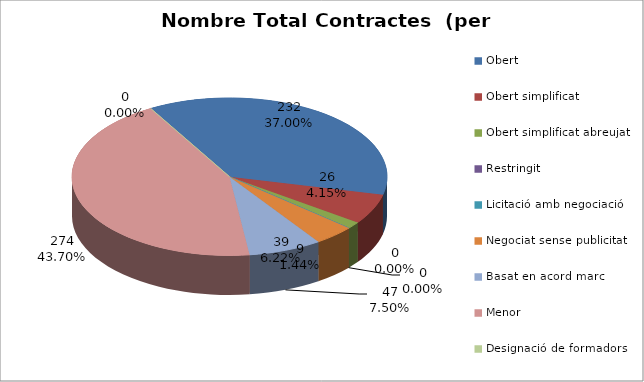
| Category | Nombre Total Contractes |
|---|---|
| Obert | 232 |
| Obert simplificat | 39 |
| Obert simplificat abreujat | 9 |
| Restringit | 0 |
| Licitació amb negociació | 0 |
| Negociat sense publicitat | 26 |
| Basat en acord marc | 47 |
| Menor | 274 |
| Designació de formadors | 0 |